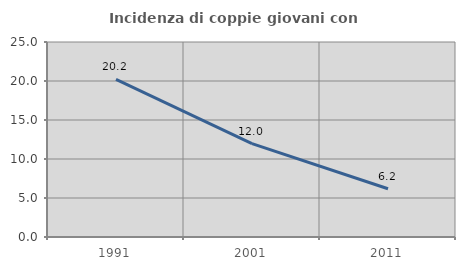
| Category | Incidenza di coppie giovani con figli |
|---|---|
| 1991.0 | 20.218 |
| 2001.0 | 11.977 |
| 2011.0 | 6.19 |